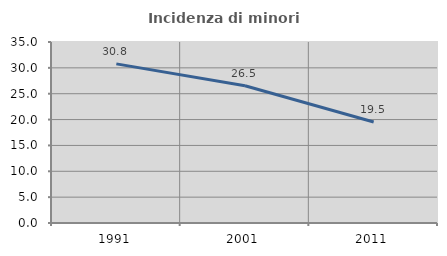
| Category | Incidenza di minori stranieri |
|---|---|
| 1991.0 | 30.769 |
| 2001.0 | 26.531 |
| 2011.0 | 19.535 |